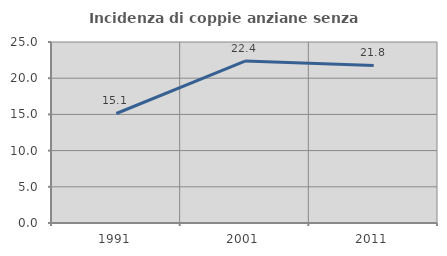
| Category | Incidenza di coppie anziane senza figli  |
|---|---|
| 1991.0 | 15.125 |
| 2001.0 | 22.36 |
| 2011.0 | 21.759 |